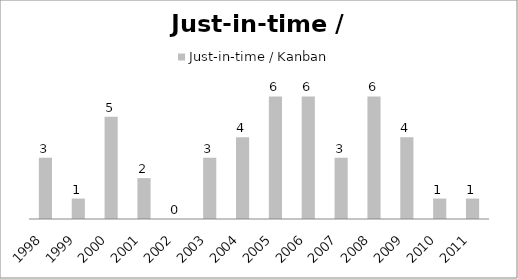
| Category | Just-in-time / Kanban  |
|---|---|
| 1998.0 | 3 |
| 1999.0 | 1 |
| 2000.0 | 5 |
| 2001.0 | 2 |
| 2002.0 | 0 |
| 2003.0 | 3 |
| 2004.0 | 4 |
| 2005.0 | 6 |
| 2006.0 | 6 |
| 2007.0 | 3 |
| 2008.0 | 6 |
| 2009.0 | 4 |
| 2010.0 | 1 |
| 2011.0 | 1 |